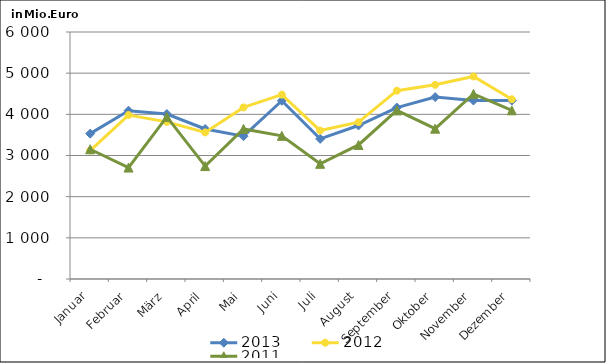
| Category | 2013 | 2012 | 2011 |
|---|---|---|---|
| Januar | 3530.577 | 3120.541 | 3151.919 |
| Februar | 4087.324 | 3983 | 2706.826 |
| März | 4007.991 | 3816.753 | 3938.031 |
| April | 3644.317 | 3561.07 | 2742.729 |
| Mai | 3469.196 | 4168.262 | 3645.933 |
| Juni | 4329.534 | 4478.286 | 3477.526 |
| Juli | 3404.091 | 3606.072 | 2797.806 |
| August | 3728.787 | 3810.848 | 3256.935 |
| September | 4164.446 | 4574.131 | 4095.695 |
| Oktober | 4418.805 | 4717.598 | 3650.94 |
| November | 4335.99 | 4920.082 | 4495.288 |
| Dezember | 4335.636 | 4366.311 | 4097.836 |